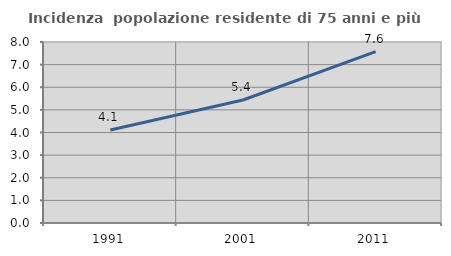
| Category | Incidenza  popolazione residente di 75 anni e più |
|---|---|
| 1991.0 | 4.113 |
| 2001.0 | 5.435 |
| 2011.0 | 7.572 |